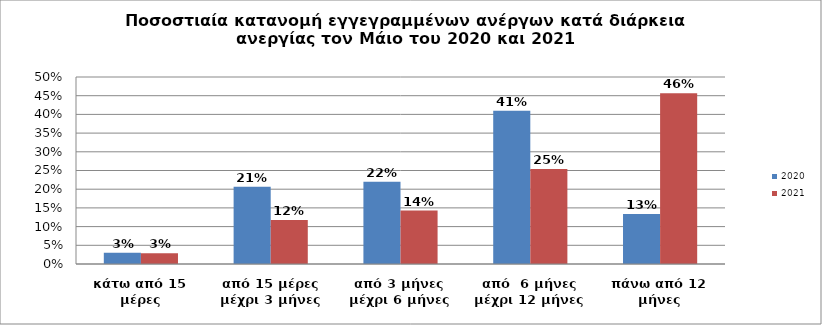
| Category | 2020 | 2021 |
|---|---|---|
| κάτω από 15 μέρες | 0.03 | 0.029 |
| από 15 μέρες μέχρι 3 μήνες | 0.207 | 0.118 |
| από 3 μήνες μέχρι 6 μήνες | 0.22 | 0.143 |
| από  6 μήνες μέχρι 12 μήνες | 0.41 | 0.254 |
| πάνω από 12 μήνες | 0.134 | 0.456 |